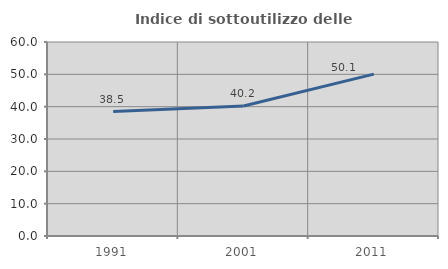
| Category | Indice di sottoutilizzo delle abitazioni  |
|---|---|
| 1991.0 | 38.504 |
| 2001.0 | 40.198 |
| 2011.0 | 50.07 |